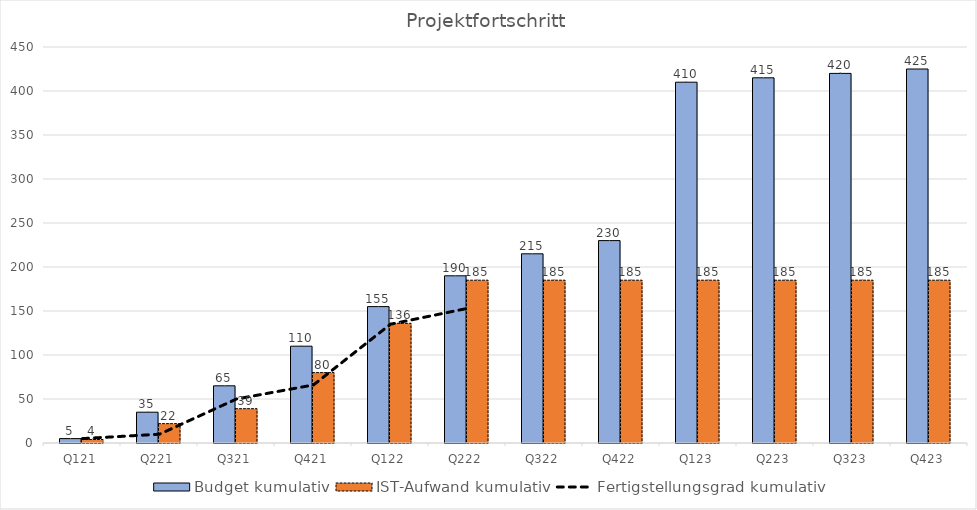
| Category | Budget kumulativ | IST-Aufwand kumulativ |
|---|---|---|
| Q121 | 5 | 4 |
| Q221 | 35 | 22 |
| Q321 | 65 | 39 |
| Q421 | 110 | 80 |
| Q122 | 155 | 136 |
| Q222 | 190 | 185 |
| Q322 | 215 | 185 |
| Q422 | 230 | 185 |
| Q123 | 410 | 185 |
| Q223 | 415 | 185 |
| Q323 | 420 | 185 |
| Q423 | 425 | 185 |